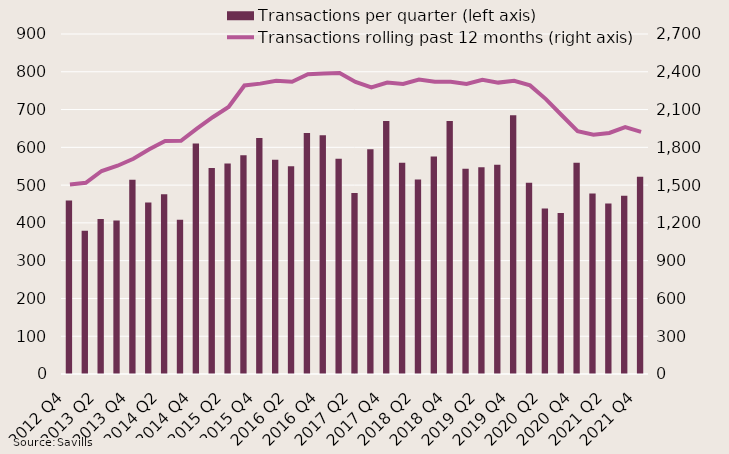
| Category | Transactions per quarter (left axis) |
|---|---|
| 2012 Q4 | 459 |
| 2013 Q1 | 379 |
| 2013 Q2 | 410 |
| 2013 Q3 | 406 |
| 2013 Q4 | 514 |
| 2014 Q1 | 454 |
| 2014 Q2 | 476 |
| 2014 Q3 | 408 |
| 2014 Q4 | 610 |
| 2015 Q1 | 545 |
| 2015 Q2 | 557 |
| 2015 Q3 | 579 |
| 2015 Q4 | 625 |
| 2016 Q1 | 567 |
| 2016 Q2 | 550 |
| 2016 Q3 | 638 |
| 2016 Q4 | 632 |
| 2017 Q1 | 570 |
| 2017 Q2 | 479 |
| 2017 Q3 | 595 |
| 2017 Q4 | 670 |
| 2018 Q1 | 559 |
| 2018 Q2 | 515 |
| 2018 Q3 | 576 |
| 2018 Q4 | 670 |
| 2019 Q1 | 543 |
| 2019 Q2 | 547 |
| 2019 Q3 | 554 |
| 2019 Q4 | 685 |
| 2020 Q1 | 506 |
| 2020 Q2 | 438 |
| 2020 Q3 | 426 |
| 2020 Q4 | 559 |
| 2021 Q1 | 478 |
| 2021 Q2 | 451 |
| 2021 Q3 | 472 |
| 2021 Q4 | 522 |